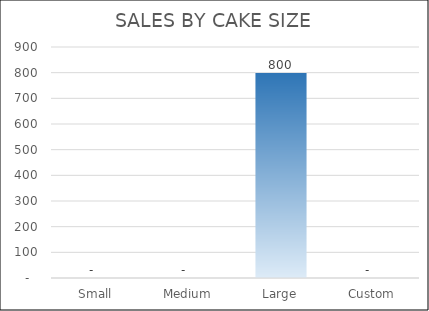
| Category | AMOUNT |
|---|---|
| Small | 0 |
| Medium | 0 |
| Large | 800 |
| Custom | 0 |